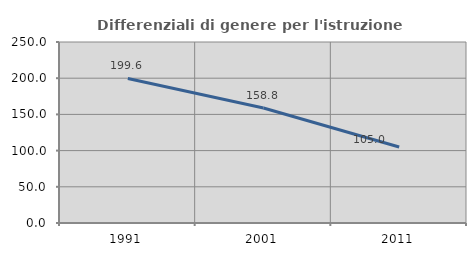
| Category | Differenziali di genere per l'istruzione superiore |
|---|---|
| 1991.0 | 199.638 |
| 2001.0 | 158.824 |
| 2011.0 | 104.977 |